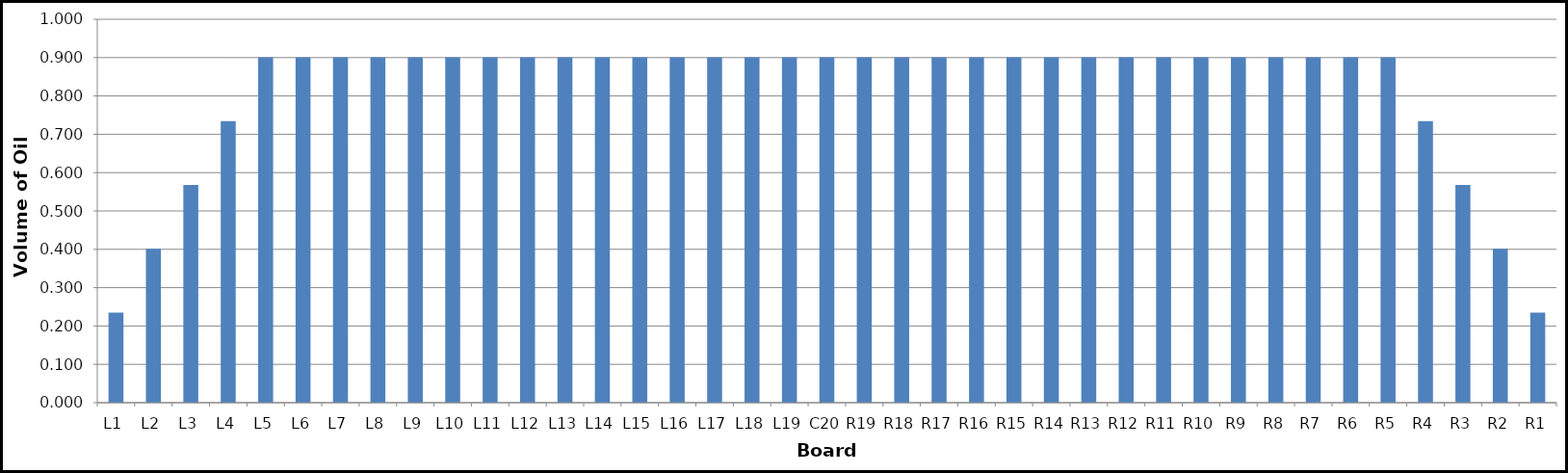
| Category | Series 0 |
|---|---|
| L1 | 0.235 |
| L2 | 0.402 |
| L3 | 0.568 |
| L4 | 0.734 |
| L5 | 0.901 |
| L6 | 0.901 |
| L7 | 0.901 |
| L8 | 0.901 |
| L9 | 0.901 |
| L10 | 0.901 |
| L11 | 0.901 |
| L12 | 0.901 |
| L13 | 0.901 |
| L14 | 0.901 |
| L15 | 0.901 |
| L16 | 0.901 |
| L17 | 0.901 |
| L18 | 0.901 |
| L19 | 0.901 |
| C20 | 0.901 |
| R19 | 0.901 |
| R18 | 0.901 |
| R17 | 0.901 |
| R16 | 0.901 |
| R15 | 0.901 |
| R14 | 0.901 |
| R13 | 0.901 |
| R12 | 0.901 |
| R11 | 0.901 |
| R10 | 0.901 |
| R9 | 0.901 |
| R8 | 0.901 |
| R7 | 0.901 |
| R6 | 0.901 |
| R5 | 0.901 |
| R4 | 0.734 |
| R3 | 0.568 |
| R2 | 0.402 |
| R1 | 0.235 |